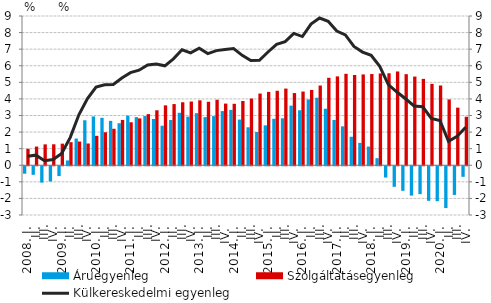
| Category | Áruegyenleg | Szolgáltatásegyenleg |
|---|---|---|
| 2008. I. | -0.45 | 0.991 |
|          II. | -0.517 | 1.126 |
|          III. | -0.986 | 1.26 |
|          IV. | -0.919 | 1.265 |
| 2009. I. | -0.594 | 1.303 |
|          II. | 0.29 | 1.392 |
|          III. | 1.61 | 1.43 |
|          IV. | 2.713 | 1.313 |
| 2010. I. | 2.944 | 1.776 |
|          II. | 2.862 | 1.99 |
|          III. | 2.676 | 2.199 |
|          IV. | 2.533 | 2.732 |
| 2011. I. | 2.989 | 2.593 |
|          II. | 2.903 | 2.826 |
|          III. | 2.968 | 3.084 |
|          IV. | 2.79 | 3.315 |
| 2012. I. | 2.384 | 3.612 |
|          II. | 2.73 | 3.689 |
|          III. | 3.163 | 3.799 |
|          IV. | 2.932 | 3.843 |
| 2013. I. | 3.14 | 3.916 |
| II. | 2.903 | 3.829 |
|          III. | 2.964 | 3.949 |
| IV. | 3.266 | 3.718 |
| 2014. I. | 3.336 | 3.706 |
| II. | 2.753 | 3.875 |
|          III. | 2.29 | 4.023 |
| IV. | 2.003 | 4.324 |
| 2015. I. | 2.406 | 4.424 |
| II. | 2.802 | 4.491 |
|          III. | 2.832 | 4.623 |
| IV. | 3.594 | 4.353 |
| 2016. I. | 3.316 | 4.444 |
| II. | 3.971 | 4.542 |
|          III. | 4.072 | 4.808 |
| IV. | 3.409 | 5.275 |
| 2017. I. | 2.731 | 5.358 |
| II. | 2.347 | 5.514 |
|          III. | 1.718 | 5.443 |
| IV. | 1.35 | 5.477 |
| 2018. I. | 1.126 | 5.5 |
| II. | 0.427 | 5.535 |
|          III. | -0.68 | 5.545 |
| IV. | -1.239 | 5.655 |
| 2019. I. | -1.482 | 5.492 |
| II. | -1.771 | 5.348 |
|          III. | -1.683 | 5.208 |
| IV. | -2.084 | 4.908 |
| 2020. I. | -2.108 | 4.811 |
| II. | -2.522 | 3.968 |
|          III. | -1.73 | 3.474 |
| IV. | -0.638 | 2.925 |